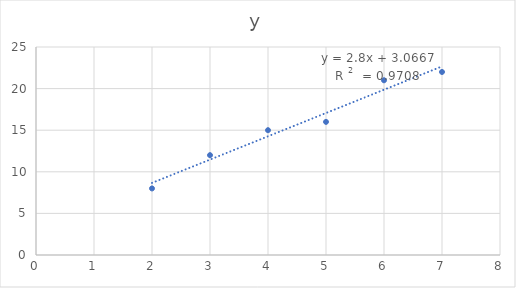
| Category | y |
|---|---|
| 2.0 | 8 |
| 3.0 | 12 |
| 4.0 | 15 |
| 5.0 | 16 |
| 6.0 | 21 |
| 7.0 | 22 |